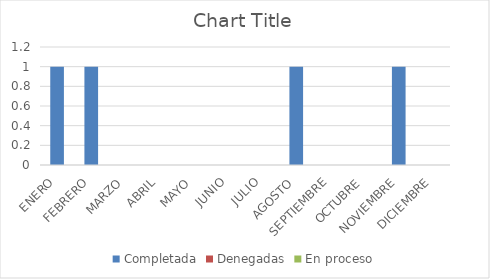
| Category | Completada | Denegadas | En proceso |
|---|---|---|---|
| ENERO | 1 | 0 | 0 |
| FEBRERO | 1 | 0 | 0 |
| MARZO | 0 | 0 | 0 |
| ABRIL | 0 | 0 | 0 |
| MAYO | 0 | 0 | 0 |
| JUNIO | 0 | 0 | 0 |
| JULIO | 0 | 0 | 0 |
| AGOSTO | 1 | 0 | 0 |
| SEPTIEMBRE | 0 | 0 | 0 |
| OCTUBRE | 0 | 0 | 0 |
| NOVIEMBRE | 1 | 0 | 0 |
| DICIEMBRE | 0 | 0 | 0 |